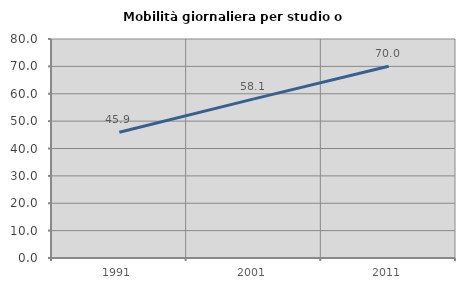
| Category | Mobilità giornaliera per studio o lavoro |
|---|---|
| 1991.0 | 45.937 |
| 2001.0 | 58.135 |
| 2011.0 | 70.044 |